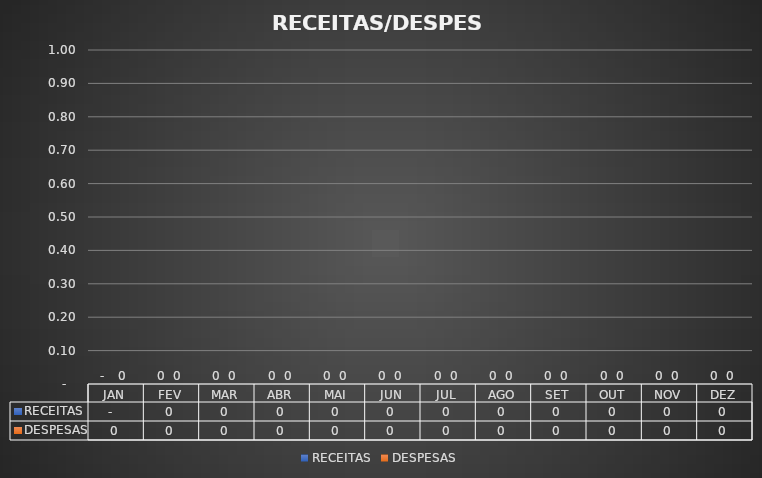
| Category | RECEITAS | DESPESAS |
|---|---|---|
| JAN | 0 | 0 |
| FEV | 0 | 0 |
| MAR | 0 | 0 |
| ABR | 0 | 0 |
| MAI | 0 | 0 |
| JUN | 0 | 0 |
| JUL | 0 | 0 |
| AGO | 0 | 0 |
| SET | 0 | 0 |
| OUT | 0 | 0 |
| NOV | 0 | 0 |
| DEZ | 0 | 0 |